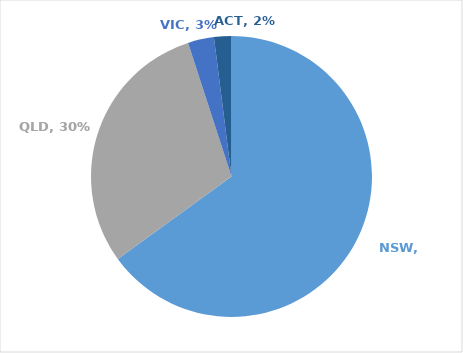
| Category | Series 0 |
|---|---|
| NSW | 0.65 |
| QLD | 0.3 |
| VIC | 0.03 |
| ACT | 0.02 |